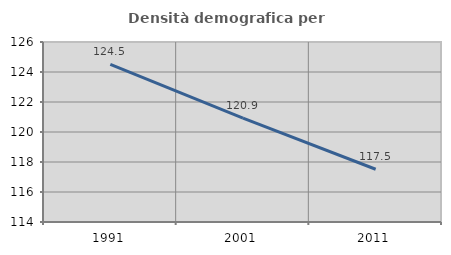
| Category | Densità demografica |
|---|---|
| 1991.0 | 124.507 |
| 2001.0 | 120.931 |
| 2011.0 | 117.518 |